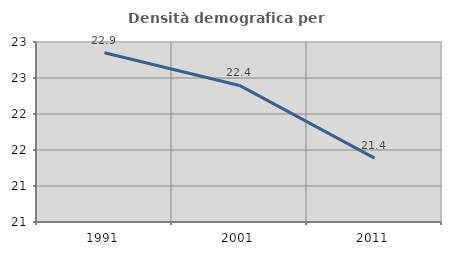
| Category | Densità demografica |
|---|---|
| 1991.0 | 22.85 |
| 2001.0 | 22.397 |
| 2011.0 | 21.386 |